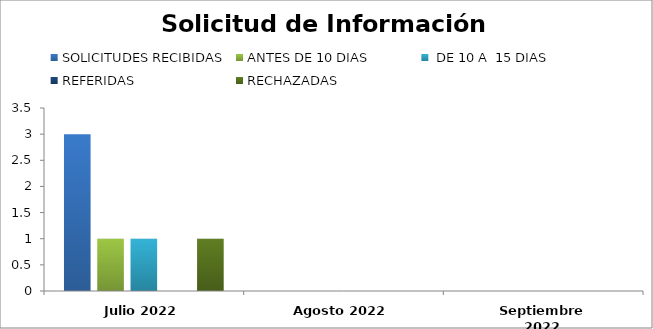
| Category | SOLICITUDES RECIBIDAS | ANTES DE 10 DIAS |  DE 10 A  15 DIAS  | REFERIDAS | RECHAZADAS | FUERA DE PLAZO |
|---|---|---|---|---|---|---|
| Julio 2022 | 3 | 1 | 1 | 0 | 1 |  |
| Agosto 2022 | 0 | 0 | 0 | 0 | 0 |  |
| Septiembre 2022 | 0 | 0 | 0 | 0 | 0 |  |